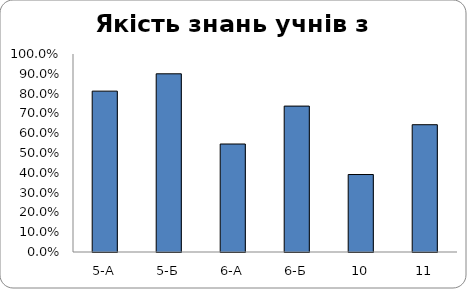
| Category | Series 0 |
|---|---|
| 5-А | 0.812 |
| 5-Б | 0.9 |
| 6-А | 0.545 |
| 6-Б | 0.737 |
| 10 | 0.391 |
| 11 | 0.643 |